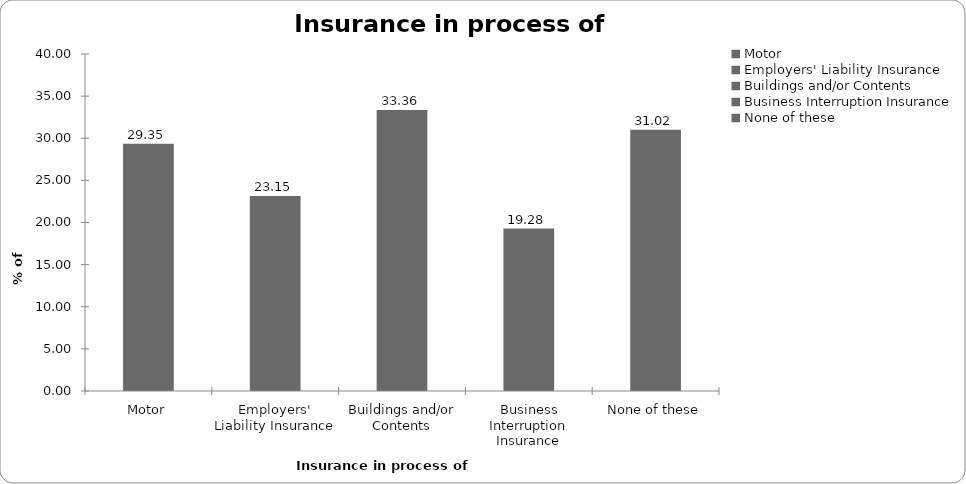
| Category | Insurance in process of buying |
|---|---|
| Motor | 29.353 |
| Employers' Liability Insurance | 23.149 |
| Buildings and/or Contents | 33.356 |
| Business Interruption Insurance | 19.28 |
| None of these | 31.021 |